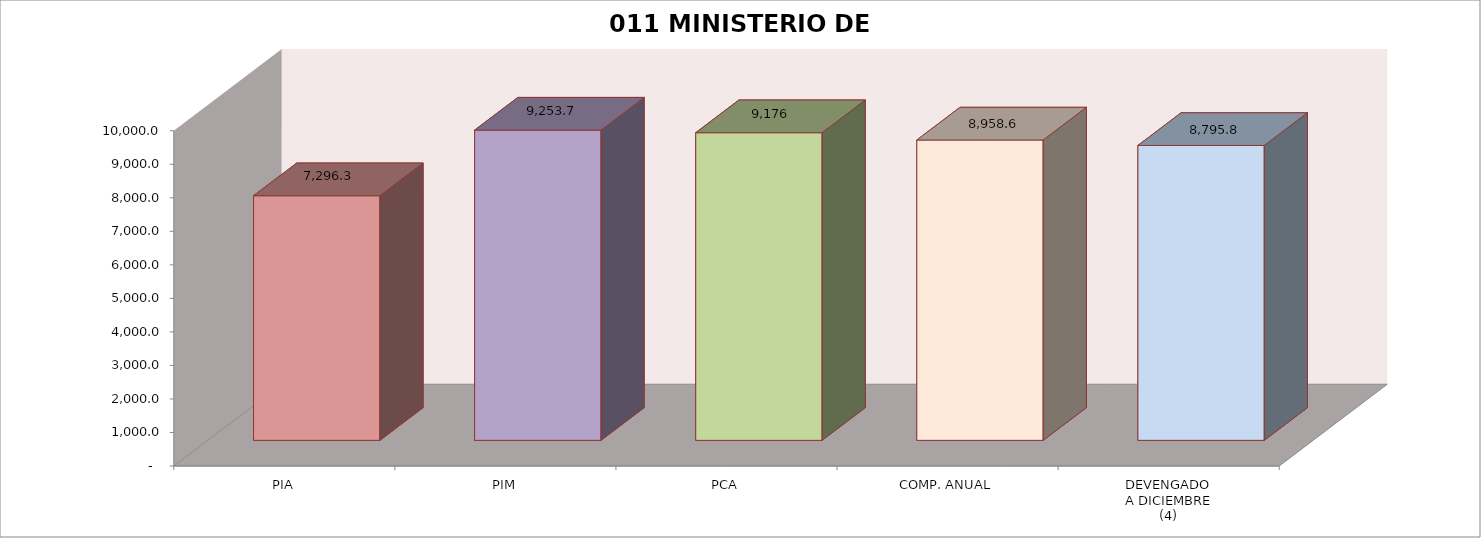
| Category | 011 MINISTERIO DE SALUD |
|---|---|
| PIA | 7296.309 |
| PIM | 9253.718 |
| PCA | 9176.299 |
| COMP. ANUAL | 8958.56 |
| DEVENGADO
A DICIEMBRE
(4) | 8795.791 |